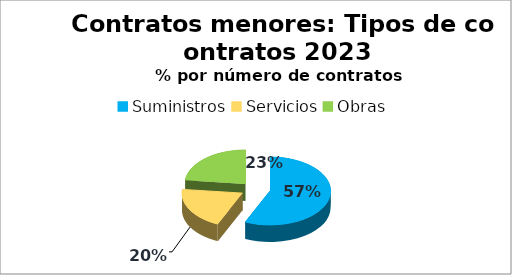
| Category | Series 0 |
|---|---|
| Suministros | 602 |
| Servicios | 213 |
| Obras | 247 |